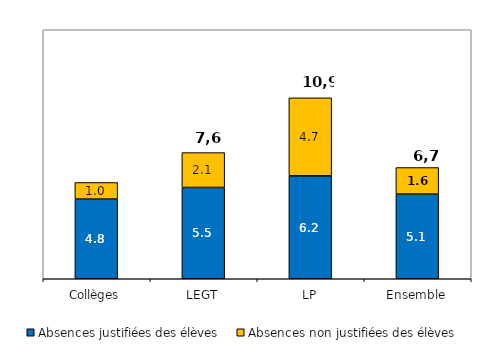
| Category | Absences justifiées des élèves | Absences non justifiées des élèves |
|---|---|---|
| Collèges | 4.8 | 1 |
| LEGT | 5.5 | 2.1 |
| LP | 6.2 | 4.7 |
| Ensemble | 5.1 | 1.6 |